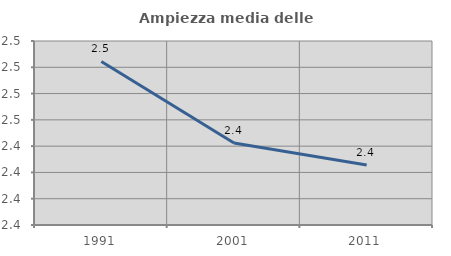
| Category | Ampiezza media delle famiglie |
|---|---|
| 1991.0 | 2.504 |
| 2001.0 | 2.442 |
| 2011.0 | 2.426 |